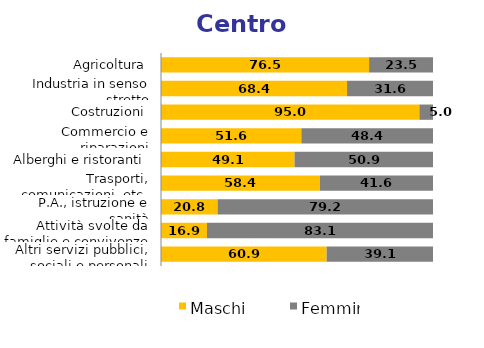
| Category | Maschi | Femmine |
|---|---|---|
| Agricoltura | 76.5 | 23.5 |
| Industria in senso stretto | 68.4 | 31.6 |
| Costruzioni | 95 | 5 |
| Commercio e riparazioni | 51.6 | 48.4 |
| Alberghi e ristoranti | 49.1 | 50.9 |
| Trasporti, comunicazioni, etc. | 58.4 | 41.6 |
| P.A., istruzione e sanità | 20.8 | 79.2 |
| Attività svolte da famiglie e convivenze | 16.9 | 83.1 |
| Altri servizi pubblici, sociali e personali | 60.9 | 39.1 |